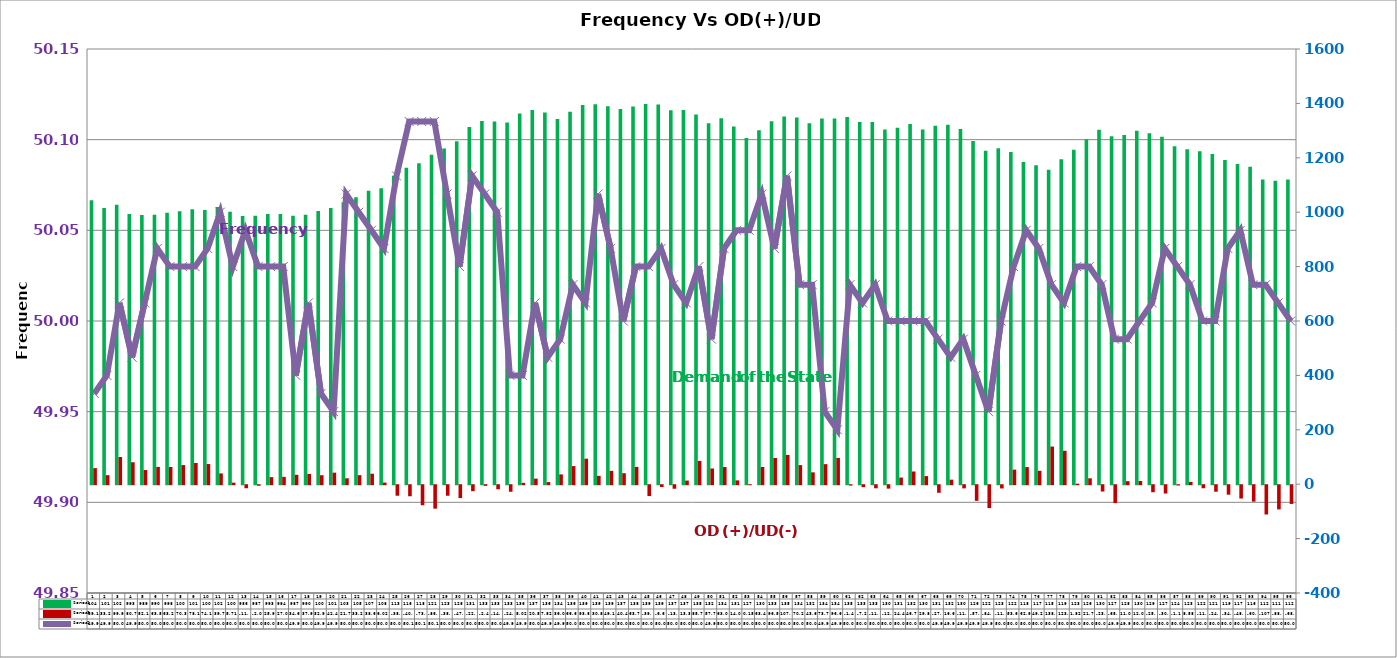
| Category | Series 2 | Series 4 |
|---|---|---|
| 0 | 1043.63 | 59.16 |
| 1 | 1015 | 33.21 |
| 2 | 1026.95 | 99.92 |
| 3 | 993.4 | 80.76 |
| 4 | 989.33 | 52.15 |
| 5 | 990.49 | 63.57 |
| 6 | 998.12 | 63.2 |
| 7 | 1003.81 | 70.39 |
| 8 | 1011.21 | 78.11 |
| 9 | 1008.11 | 74.1 |
| 10 | 1019.55 | 39.73 |
| 11 | 1002.08 | 5.71 |
| 12 | 986.45 | -11.12 |
| 13 | 987.26 | -2.04 |
| 14 | 993.14 | 25.95 |
| 15 | 993.83 | 27.01 |
| 16 | 986.67 | 34.65 |
| 17 | 990.49 | 37.9 |
| 18 | 1004.82 | 32.99 |
| 19 | 1015.01 | 42.44 |
| 20 | 1036.64 | 21.73 |
| 21 | 1055.24 | 33.27 |
| 22 | 1078.81 | 38.65 |
| 23 | 1088.49 | 6.02 |
| 24 | 1133.66 | -38.67 |
| 25 | 1163.36 | -40.69 |
| 26 | 1180.23 | -73.77 |
| 27 | 1211.49 | -86.21 |
| 28 | 1234.48 | -38.76 |
| 29 | 1261.26 | -47.4 |
| 30 | 1312.78 | -22.04 |
| 31 | 1335.45 | -2.49 |
| 32 | 1333.26 | -14.95 |
| 33 | 1329.94 | -24.09 |
| 34 | 1362.86 | 5.02 |
| 35 | 1375.78 | 20.56 |
| 36 | 1366.87 | 7.82 |
| 37 | 1343.04 | 36.04 |
| 38 | 1368.96 | 66.6 |
| 39 | 1394.47 | 93.83 |
| 40 | 1396.68 | 30.86 |
| 41 | 1389.77 | 49.1 |
| 42 | 1379.22 | 40.47 |
| 43 | 1388.98 | 63.73 |
| 44 | 1397.91 | -39.96 |
| 45 | 1395.63 | -6.62 |
| 46 | 1375.15 | -13.05 |
| 47 | 1375.45 | 13.31 |
| 48 | 1359.13 | 85.73 |
| 49 | 1326.97 | 57.79 |
| 50 | 1345.19 | 63.03 |
| 51 | 1315.35 | 14.02 |
| 52 | 1273.17 | 0.15 |
| 53 | 1301.26 | 63.41 |
| 54 | 1334.43 | 96.53 |
| 55 | 1351.62 | 107.76 |
| 56 | 1347.89 | 70.23 |
| 57 | 1326.78 | 43.66 |
| 58 | 1344.33 | 73.7 |
| 59 | 1344.83 | 96.62 |
| 60 | 1350.37 | -1.44 |
| 61 | 1331.6 | -7.23 |
| 62 | 1331.33 | -11.37 |
| 63 | 1304.323 | -12.51 |
| 64 | 1310.83 | 24.45 |
| 65 | 1324.02 | 46.74 |
| 66 | 1304.25 | 29.89 |
| 67 | 1317.38 | -27.85 |
| 68 | 1321.91 | 16.67 |
| 69 | 1305.91 | -11.67 |
| 70 | 1261.74 | -57.49 |
| 71 | 1225.64 | -84.27 |
| 72 | 1234.73 | -11.94 |
| 73 | 1221.64 | 53.66 |
| 74 | 1184.46 | 62.97 |
| 75 | 1172.41 | 49.29 |
| 76 | 1156.33 | 138.5 |
| 77 | 1194.76 | 123.01 |
| 78 | 1229.91 | 1.82 |
| 79 | 1267.8 | 21.7 |
| 80 | 1303.16 | -23.26 |
| 81 | 1279.38 | -65.92 |
| 82 | 1284.14 | 11.09 |
| 83 | 1299.79 | 12.01 |
| 84 | 1290.46 | -25.87 |
| 85 | 1276.99 | -30.59 |
| 86 | 1242.45 | -1.11 |
| 87 | 1231.23 | 8.58 |
| 88 | 1224.12 | -11.13 |
| 89 | 1213.57 | -24.02 |
| 90 | 1192.27 | -34.85 |
| 91 | 1177.59 | -48.89 |
| 92 | 1166.85 | -60.48 |
| 93 | 1120.29 | -107.64 |
| 94 | 1115.81 | -88.99 |
| 95 | 1120.66 | -68.94 |